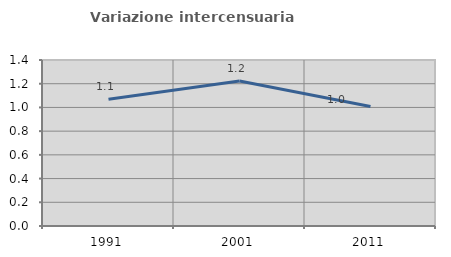
| Category | Variazione intercensuaria annua |
|---|---|
| 1991.0 | 1.069 |
| 2001.0 | 1.223 |
| 2011.0 | 1.007 |